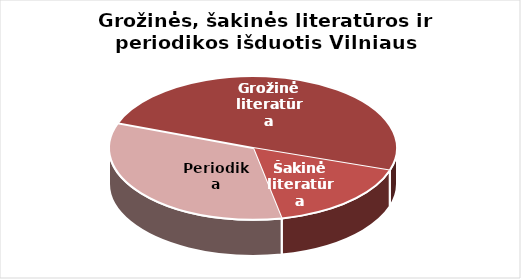
| Category | Series 0 |
|---|---|
| Grožinė literatūra | 1249700 |
| Šakinė literatūra | 422195 |
| Periodika | 851387 |